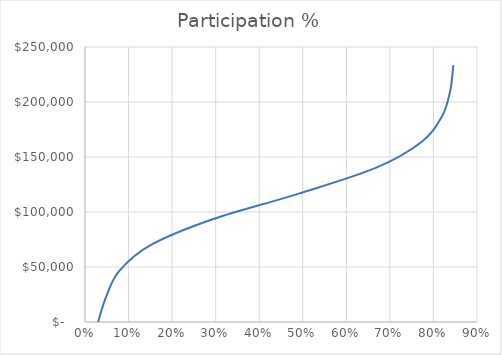
| Category | Series 0 |
|---|---|
| 0.8457194818938817 | 233413.019 |
| 0.8384677933202613 | 210071.717 |
| 0.8193918879624933 | 186730.415 |
| 0.7718133317327375 | 163389.113 |
| 0.6673857668128285 | 140047.811 |
| 0.49098469678598833 | 116706.509 |
| 0.29307355681529673 | 93365.207 |
| 0.15139882413310923 | 70023.906 |
| 0.07927113880772425 | 46682.604 |
| 0.04884148976079688 | 23341.302 |
| 0.03 | 0 |